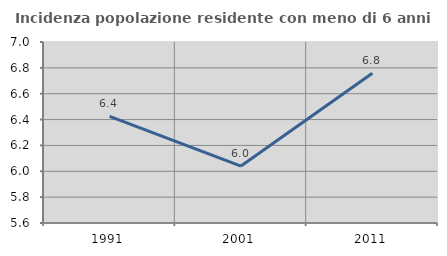
| Category | Incidenza popolazione residente con meno di 6 anni |
|---|---|
| 1991.0 | 6.425 |
| 2001.0 | 6.04 |
| 2011.0 | 6.759 |